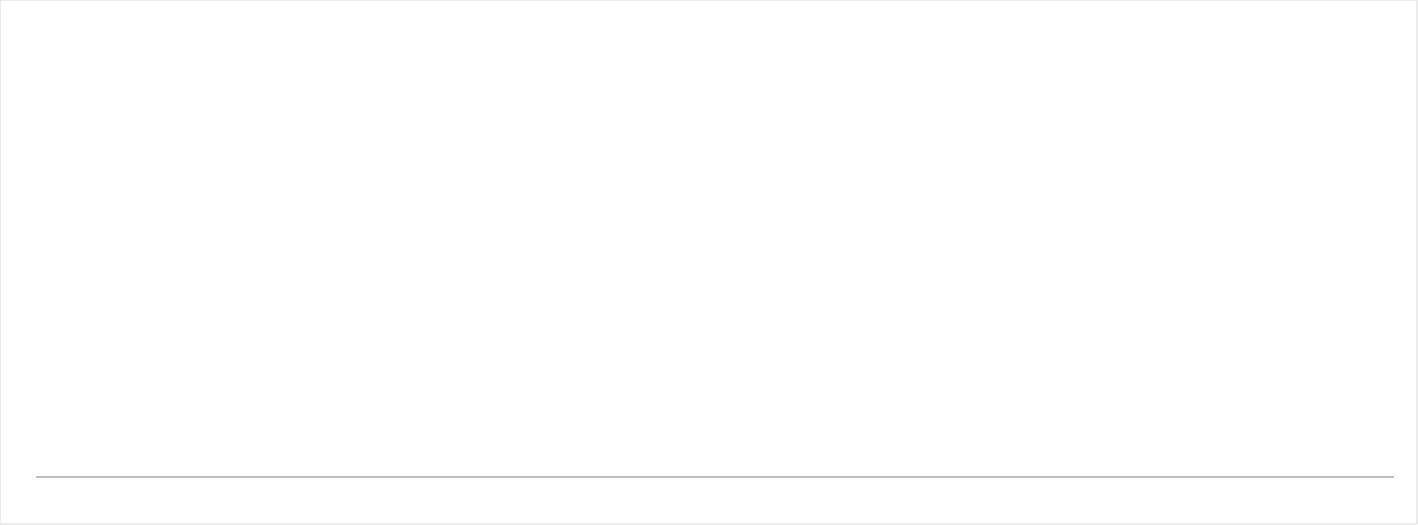
| Category | liczba zdających |
|---|---|
| 1.0 | 0 |
| 2.0 | 0 |
| 3.0 | 0 |
| 4.0 | 0 |
| 5.0 | 0 |
| 6.0 | 0 |
| 7.0 | 0 |
| 8.0 | 0 |
| 9.0 | 0 |
| 10.0 | 0 |
| 11.0 | 0 |
| 12.0 | 0 |
| 13.0 | 0 |
| 14.0 | 0 |
| 15.0 | 0 |
| 16.0 | 0 |
| 17.0 | 0 |
| 18.0 | 0 |
| 19.0 | 0 |
| 20.0 | 0 |
| 21.0 | 0 |
| 22.0 | 0 |
| 23.0 | 0 |
| 24.0 | 0 |
| 25.0 | 0 |
| 26.0 | 0 |
| 27.0 | 0 |
| 28.0 | 0 |
| 29.0 | 0 |
| 30.0 | 0 |
| 31.0 | 0 |
| 32.0 | 0 |
| 33.0 | 0 |
| 34.0 | 0 |
| 35.0 | 0 |
| 36.0 | 0 |
| 37.0 | 0 |
| 38.0 | 0 |
| 39.0 | 0 |
| 40.0 | 0 |
| 41.0 | 0 |
| 42.0 | 0 |
| 43.0 | 0 |
| 44.0 | 0 |
| 45.0 | 0 |
| 46.0 | 0 |
| 47.0 | 0 |
| 48.0 | 0 |
| 49.0 | 0 |
| 50.0 | 0 |
| 51.0 | 0 |
| 52.0 | 0 |
| 53.0 | 0 |
| 54.0 | 0 |
| 55.0 | 0 |
| 56.0 | 0 |
| 57.0 | 0 |
| 58.0 | 0 |
| 59.0 | 0 |
| 60.0 | 0 |
| 61.0 | 0 |
| 62.0 | 0 |
| 63.0 | 0 |
| 64.0 | 0 |
| 65.0 | 0 |
| 66.0 | 0 |
| 67.0 | 0 |
| 68.0 | 0 |
| 69.0 | 0 |
| 70.0 | 0 |
| 71.0 | 0 |
| 72.0 | 0 |
| 73.0 | 0 |
| 74.0 | 0 |
| 75.0 | 0 |
| 76.0 | 0 |
| 77.0 | 0 |
| 78.0 | 0 |
| 79.0 | 0 |
| 80.0 | 0 |
| 81.0 | 0 |
| 82.0 | 0 |
| 83.0 | 0 |
| 84.0 | 0 |
| 85.0 | 0 |
| 86.0 | 0 |
| 87.0 | 0 |
| 88.0 | 0 |
| 89.0 | 0 |
| 90.0 | 0 |
| 91.0 | 0 |
| 92.0 | 0 |
| 93.0 | 0 |
| 94.0 | 0 |
| 95.0 | 0 |
| 96.0 | 0 |
| 97.0 | 0 |
| 98.0 | 0 |
| 99.0 | 0 |
| 100.0 | 0 |